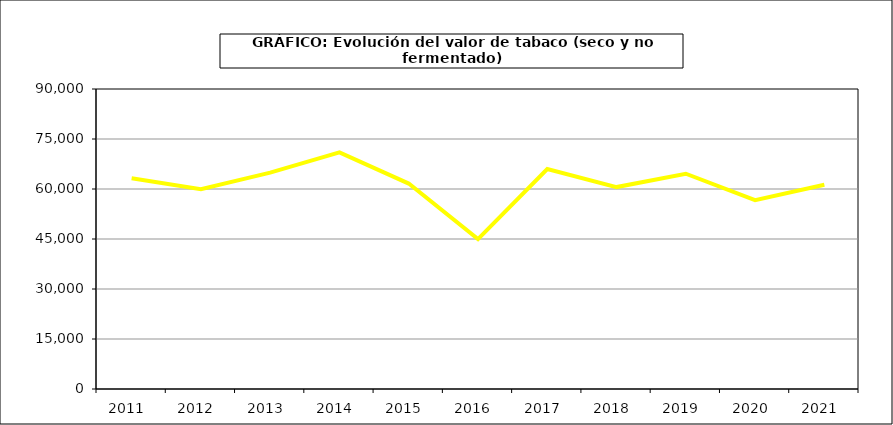
| Category | Valor |
|---|---|
| 2011.0 | 63219.669 |
| 2012.0 | 59963.648 |
| 2013.0 | 64900.043 |
| 2014.0 | 70983.122 |
| 2015.0 | 61634.5 |
| 2016.0 | 44972.9 |
| 2017.0 | 65979.385 |
| 2018.0 | 60574.168 |
| 2019.0 | 64589.269 |
| 2020.0 | 56632.122 |
| 2021.0 | 61260.992 |